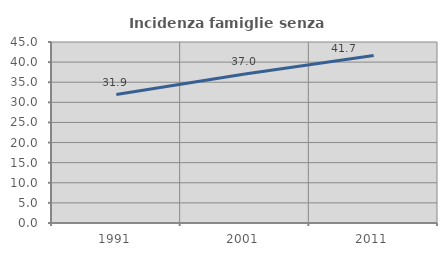
| Category | Incidenza famiglie senza nuclei |
|---|---|
| 1991.0 | 31.929 |
| 2001.0 | 37.032 |
| 2011.0 | 41.667 |